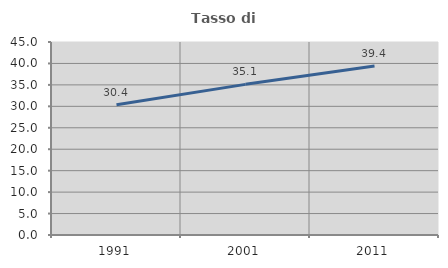
| Category | Tasso di occupazione   |
|---|---|
| 1991.0 | 30.387 |
| 2001.0 | 35.124 |
| 2011.0 | 39.39 |